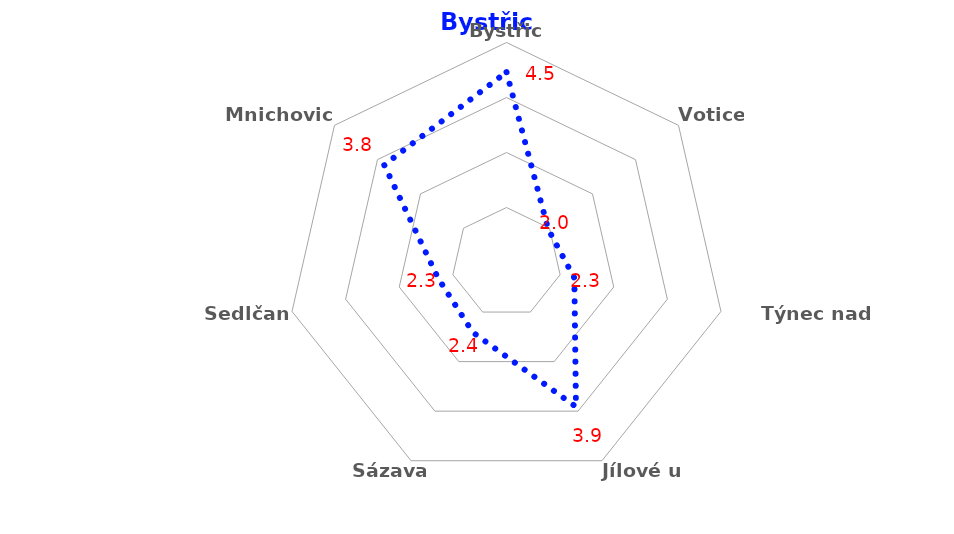
| Category | Series 0 |
|---|---|
| Bystřice | 4.461 |
| Votice | 1.97 |
| Týnec nad Sázavou | 2.265 |
| Jílové u Prahy | 3.912 |
| Sázava | 2.41 |
| Sedlčany | 2.276 |
| Mnichovice | 3.844 |